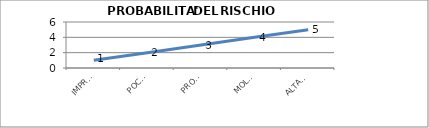
| Category | Series 0 |
|---|---|
| IMPROBABILE | 1 |
| POCO PROBABILE | 2 |
| PROBABILE | 3 |
| MOLTO PROBABILE | 4 |
| ALTAMENTE PROBABILE | 5 |